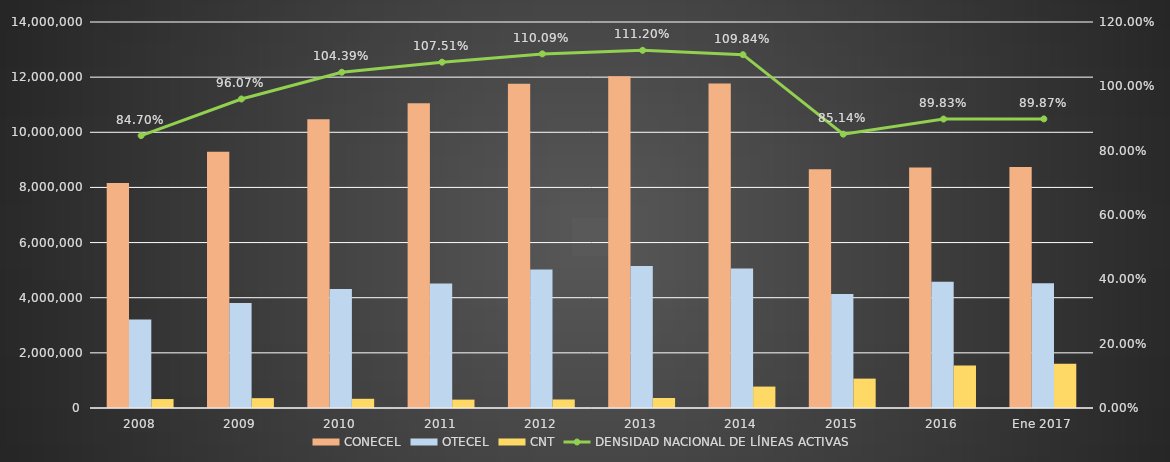
| Category | CONECEL | OTECEL | CNT |
|---|---|---|---|
| 2008 | 8156359 | 3211922 | 323967 |
| 2009 | 9291268 | 3806432 | 356900 |
| 2010 | 10470502 | 4314599 | 333730 |
| 2011 | 11057316 | 4513874 | 303368 |
| 2012 | 11757906 | 5019686 | 309271 |
| 2013 | 12030886 | 5148308 | 362560 |
| 2014 | 11772020 | 5055645 | 776892 |
| 2015 | 8658619 | 4134698 | 1065703 |
| 2016 | 8726823 | 4580092 | 1541219 |
| Ene 2017 | 8740818.931 | 4525750 | 1606657 |